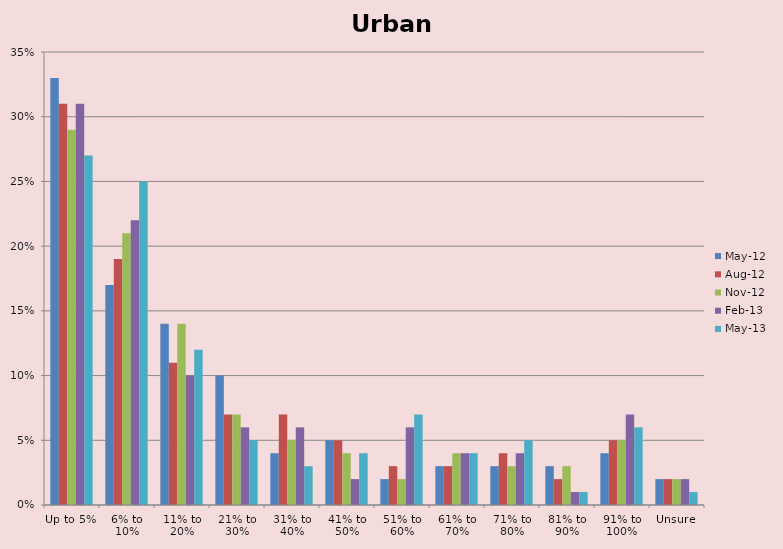
| Category | May-12 | Aug-12 | Nov-12 | Feb-13 | May-13 |
|---|---|---|---|---|---|
| Up to 5%  | 0.33 | 0.31 | 0.29 | 0.31 | 0.27 |
| 6% to 10% | 0.17 | 0.19 | 0.21 | 0.22 | 0.25 |
| 11% to 20% | 0.14 | 0.11 | 0.14 | 0.1 | 0.12 |
| 21% to 30% | 0.1 | 0.07 | 0.07 | 0.06 | 0.05 |
| 31% to 40% | 0.04 | 0.07 | 0.05 | 0.06 | 0.03 |
| 41% to 50% | 0.05 | 0.05 | 0.04 | 0.02 | 0.04 |
| 51% to 60% | 0.02 | 0.03 | 0.02 | 0.06 | 0.07 |
| 61% to 70% | 0.03 | 0.03 | 0.04 | 0.04 | 0.04 |
| 71% to 80% | 0.03 | 0.04 | 0.03 | 0.04 | 0.05 |
| 81% to 90% | 0.03 | 0.02 | 0.03 | 0.01 | 0.01 |
| 91% to 100% | 0.04 | 0.05 | 0.05 | 0.07 | 0.06 |
| Unsure | 0.02 | 0.02 | 0.02 | 0.02 | 0.01 |